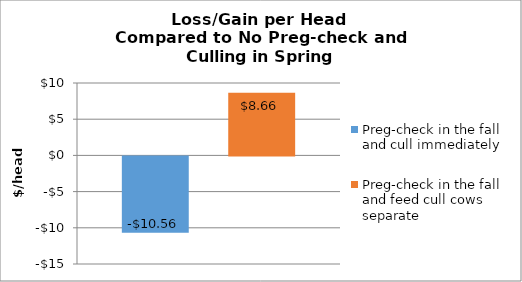
| Category | Preg-check in the fall and cull immediately | Preg-check in the fall and feed cull cows separate |
|---|---|---|
| 0 | -10.56 | 8.657 |